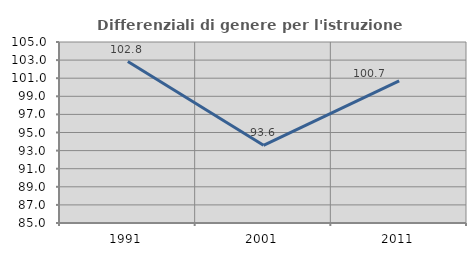
| Category | Differenziali di genere per l'istruzione superiore |
|---|---|
| 1991.0 | 102.837 |
| 2001.0 | 93.583 |
| 2011.0 | 100.71 |